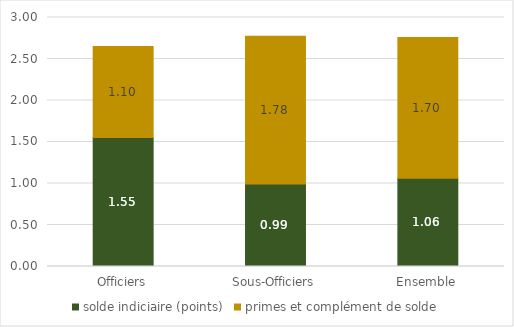
| Category | solde indiciaire (points) | primes et complément de solde |
|---|---|---|
| Officiers | 1.554 | 1.097 |
| Sous-Officiers | 0.994 | 1.782 |
| Ensemble | 1.063 | 1.697 |